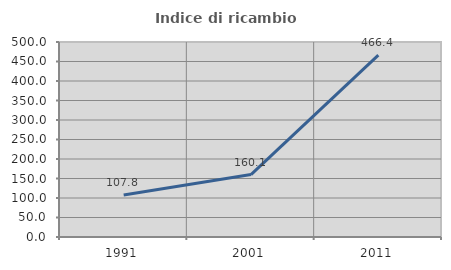
| Category | Indice di ricambio occupazionale  |
|---|---|
| 1991.0 | 107.787 |
| 2001.0 | 160.106 |
| 2011.0 | 466.364 |